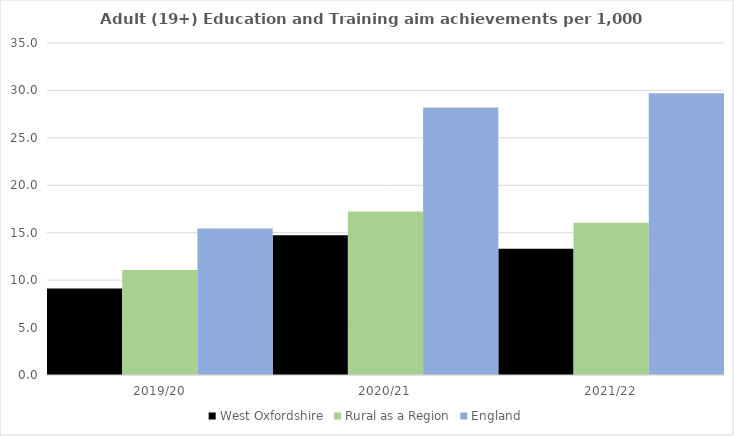
| Category | West Oxfordshire | Rural as a Region | England |
|---|---|---|---|
| 2019/20 | 9.112 | 11.081 | 15.446 |
| 2020/21 | 14.726 | 17.224 | 28.211 |
| 2021/22 | 13.312 | 16.063 | 29.711 |